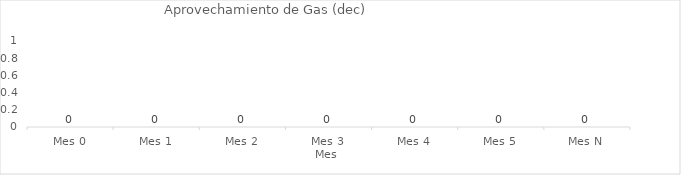
| Category | % de Aprovechamiento |
|---|---|
| Mes 0 | 0 |
| Mes 1 | 0 |
| Mes 2 | 0 |
| Mes 3 | 0 |
| Mes 4 | 0 |
| Mes 5 | 0 |
| Mes N | 0 |